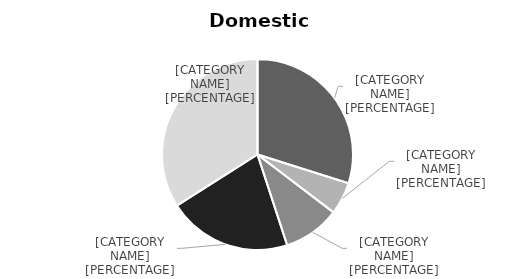
| Category | Series 0 |
|---|---|
| Hispanic/Hispanic American | 196 |
| Amer Ind/Alaskan Native | 36 |
| African American/Non Hispanic | 63 |
| Asian/Asian American | 138 |
| Multi Racial | 223 |